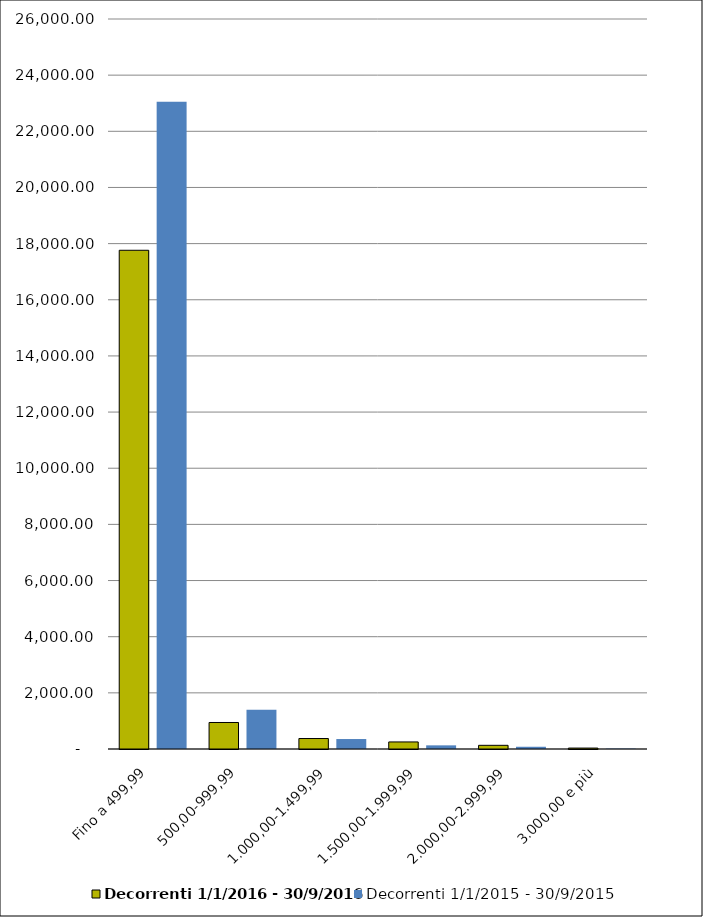
| Category | Decorrenti 1/1/2016 - 30/9/2016 | Decorrenti 1/1/2015 - 30/9/2015 |
|---|---|---|
| Fino a 499,99 | 17763 | 23054 |
| 500,00-999,99 | 944 | 1402 |
| 1.000,00-1.499,99 | 373 | 355 |
| 1.500,00-1.999,99 | 251 | 130 |
| 2.000,00-2.999,99 | 131 | 80 |
| 3.000,00 e più | 33 | 15 |